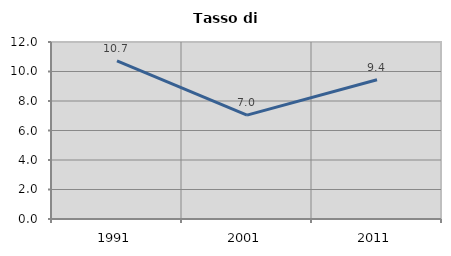
| Category | Tasso di disoccupazione   |
|---|---|
| 1991.0 | 10.726 |
| 2001.0 | 7.044 |
| 2011.0 | 9.444 |